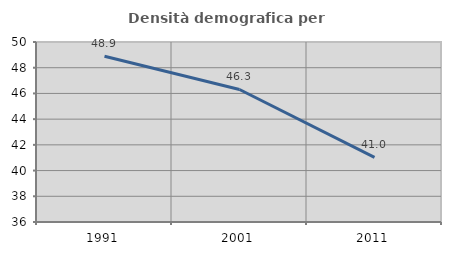
| Category | Densità demografica |
|---|---|
| 1991.0 | 48.889 |
| 2001.0 | 46.308 |
| 2011.0 | 41.026 |